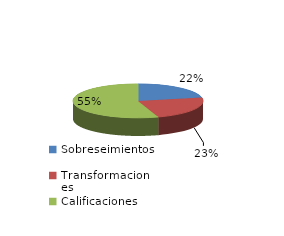
| Category | Series 0 |
|---|---|
| Sobreseimientos | 1563 |
| Transformaciones | 1648 |
| Calificaciones | 3929 |